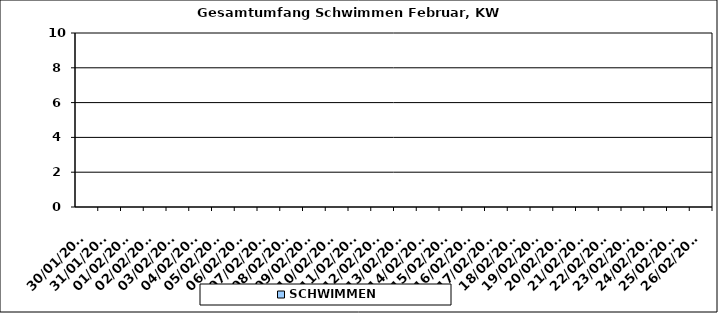
| Category | SCHWIMMEN |
|---|---|
| 30/01/2023 | 0 |
| 31/01/2023 | 0 |
| 01/02/2023 | 0 |
| 02/02/2023 | 0 |
| 03/02/2023 | 0 |
| 04/02/2023 | 0 |
| 05/02/2023 | 0 |
| 06/02/2023 | 0 |
| 07/02/2023 | 0 |
| 08/02/2023 | 0 |
| 09/02/2023 | 0 |
| 10/02/2023 | 0 |
| 11/02/2023 | 0 |
| 12/02/2023 | 0 |
| 13/02/2023 | 0 |
| 14/02/2023 | 0 |
| 15/02/2023 | 0 |
| 16/02/2023 | 0 |
| 17/02/2023 | 0 |
| 18/02/2023 | 0 |
| 19/02/2023 | 0 |
| 20/02/2023 | 0 |
| 21/02/2023 | 0 |
| 22/02/2023 | 0 |
| 23/02/2023 | 0 |
| 24/02/2023 | 0 |
| 25/02/2023 | 0 |
| 26/02/2023 | 0 |